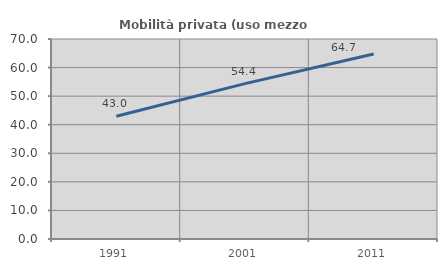
| Category | Mobilità privata (uso mezzo privato) |
|---|---|
| 1991.0 | 42.954 |
| 2001.0 | 54.371 |
| 2011.0 | 64.737 |